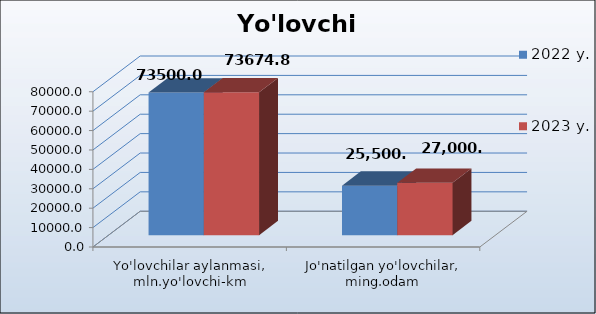
| Category | 2022 y. | 2023 y. |
|---|---|---|
| Yo'lovchilar aylanmasi, mln.yo'lovchi-km | 73500 | 73674.8 |
| Jo'natilgan yo'lovchilar, ming.odam | 25500.5 | 27000 |